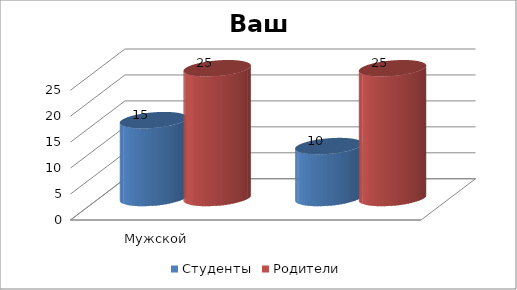
| Category | Студенты | Родители |
|---|---|---|
| Мужской | 15 | 25 |